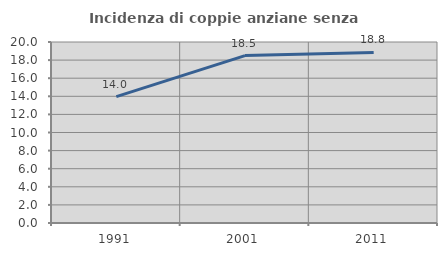
| Category | Incidenza di coppie anziane senza figli  |
|---|---|
| 1991.0 | 13.965 |
| 2001.0 | 18.495 |
| 2011.0 | 18.843 |